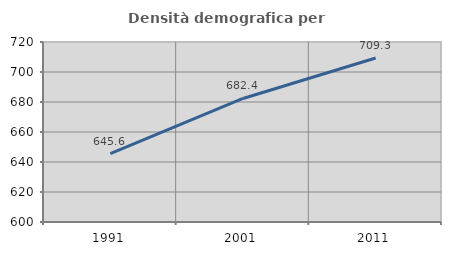
| Category | Densità demografica |
|---|---|
| 1991.0 | 645.577 |
| 2001.0 | 682.371 |
| 2011.0 | 709.294 |